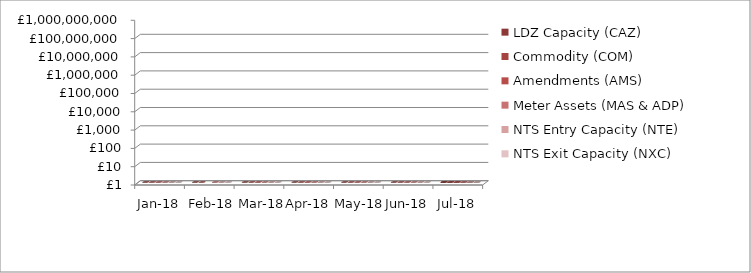
| Category | LDZ Capacity (CAZ) | Commodity (COM) | Amendments (AMS) | Meter Assets (MAS & ADP) | NTS Entry Capacity (NTE) | NTS Exit Capacity (NXC) |
|---|---|---|---|---|---|---|
| 2018-01-01 | 300085873.04 | 51013861.41 | 398601 | 193840 | 13468961.26 | 18693319.21 |
| 2018-02-01 | 271243893.07 | 49577294.91 | -97584.69 | 175082.41 | 10887736.94 | 16944144.32 |
| 2018-03-01 | 300714752.62 | 47885458.16 | 435828.94 | 193565.33 | 12522228.64 | 16944144.32 |
| 2018-04-01 | 302200317.27 | 29034584.31 | 1543453.44 | 194233.3 | 1577511.57 | 18111359.22 |
| 2018-05-01 | 312174512.16 | 19449237 | 2024085.07 | 200707.08 | 1599795.55 | 18702620.75 |
| 2018-06-01 | 302299412.99 | 14591606.04 | 2213969.29 | 194233.54 | 1621553.61 | 18117525.2 |
| 2018-07-01 | 312562745.62 | 14290600.7 | 1483244.96 | 200707.69 | 1735803.71 | 18720256.49 |
| 2018-07-01 | 312780813.69 | 15048321.28 | 830443.17 | 200263.88 | 1735803.71 | 18720256.49 |